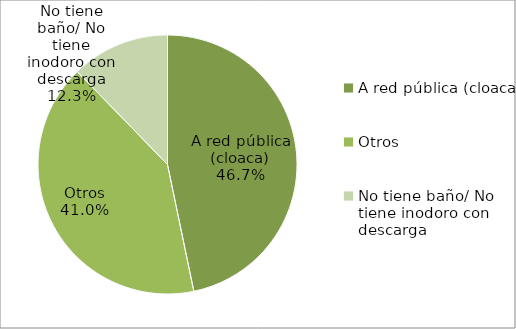
| Category | Series 0 |
|---|---|
| A red pública (cloaca) | 46.739 |
| Otros | 40.99 |
| No tiene baño/ No tiene inodoro con descarga | 12.271 |